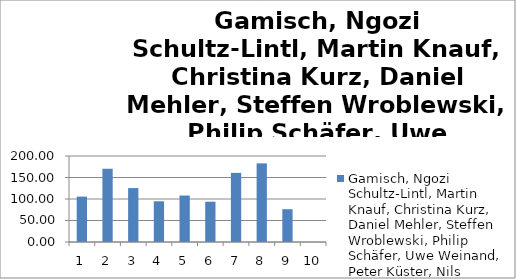
| Category | Gamisch, Ngozi Schultz-Lintl, Martin Knauf, Christina Kurz, Daniel Mehler, Steffen Wroblewski, Philip Schäfer, Uwe Weinand, Peter Küster, Nils Möller, Alexandra |
|---|---|
| 0 | 105.57 |
| 1 | 170.33 |
| 2 | 125.38 |
| 3 | 94.66 |
| 4 | 108.05 |
| 5 | 93.67 |
| 6 | 160.8 |
| 7 | 182.88 |
| 8 | 76.29 |
| 9 | 0 |